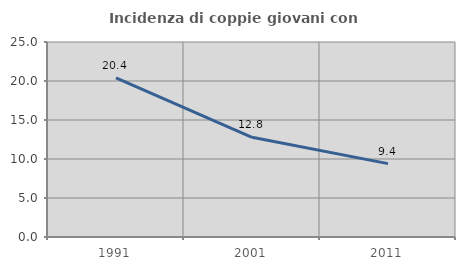
| Category | Incidenza di coppie giovani con figli |
|---|---|
| 1991.0 | 20.404 |
| 2001.0 | 12.778 |
| 2011.0 | 9.404 |